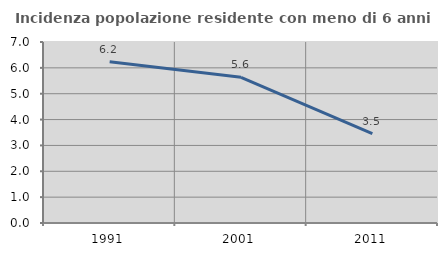
| Category | Incidenza popolazione residente con meno di 6 anni |
|---|---|
| 1991.0 | 6.236 |
| 2001.0 | 5.634 |
| 2011.0 | 3.457 |